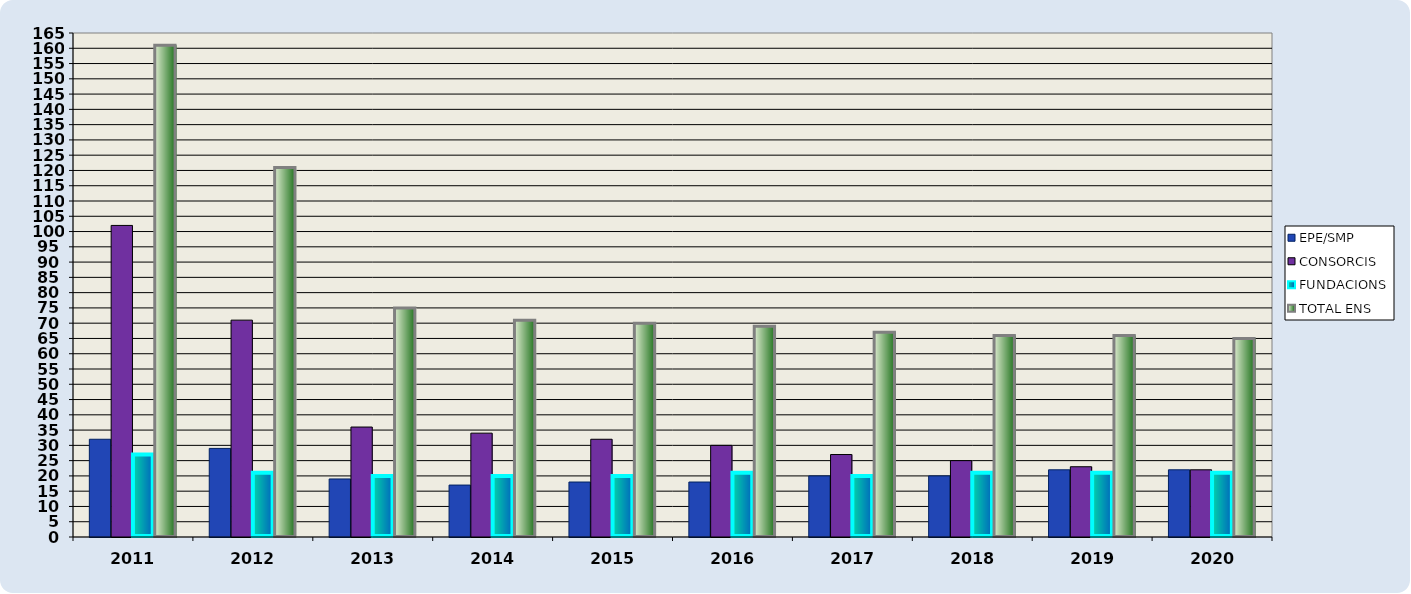
| Category | EPE/SMP | CONSORCIS | FUNDACIONS | TOTAL ENS |
|---|---|---|---|---|
| 2011.0 | 32 | 102 | 27 | 161 |
| 2012.0 | 29 | 71 | 21 | 121 |
| 2013.0 | 19 | 36 | 20 | 75 |
| 2014.0 | 17 | 34 | 20 | 71 |
| 2015.0 | 18 | 32 | 20 | 70 |
| 2016.0 | 18 | 30 | 21 | 69 |
| 2017.0 | 20 | 27 | 20 | 67 |
| 2018.0 | 20 | 25 | 21 | 66 |
| 2019.0 | 22 | 23 | 21 | 66 |
| 2020.0 | 22 | 22 | 21 | 65 |